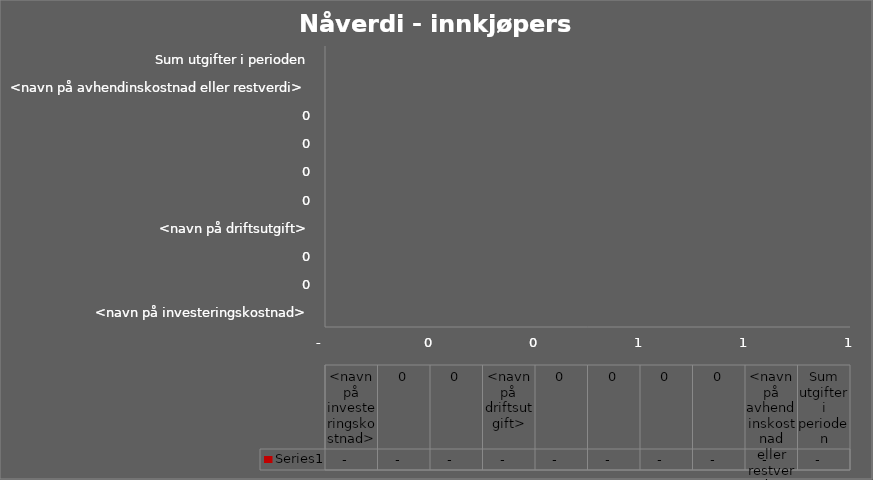
| Category | Series 0 |
|---|---|
| <navn på investeringskostnad> | 0 |
| 0,00 | 0 |
| 0,00 | 0 |
| <navn på driftsutgift> | 0 |
| 0,00 | 0 |
| 0,00 | 0 |
| 0,00 | 0 |
| 0,00 | 0 |
| <navn på avhendinskostnad eller restverdi> | 0 |
| Sum utgifter i perioden | 0 |